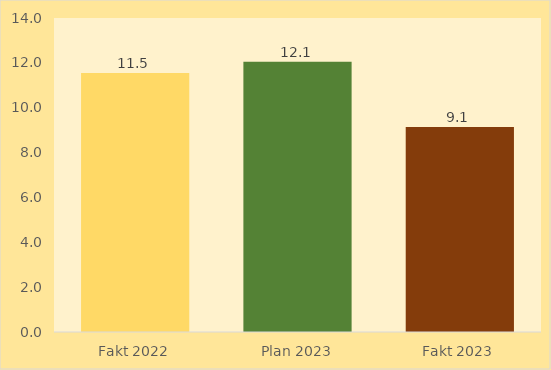
| Category | Të ardhura nga Pushteti Vendor |
|---|---|
| Fakt 2022 | 11.546 |
| Plan 2023 | 12.053 |
| Fakt 2023 | 9.146 |